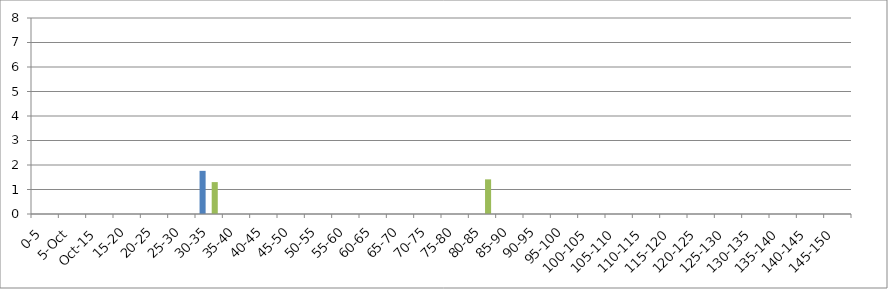
| Category | 12 UNION_ALL | 12 INTERSECTION_ALL | 12 UNION(INTERSECTION_119875_146067,INTERSECTION_119875_241240,INTERSECTION_146067_241240) |
|---|---|---|---|
| 0-5 | 0 | 0 | 0 |
| 5-Oct | 0 | 0 | 0 |
| Oct-15 | 0 | 0 | 0 |
| 15-20 | 0 | 0 | 0 |
| 20-25 | 0 | 0 | 0 |
| 25-30 | 0 | 0 | 0 |
| 30-35 | 1.761 | 0 | 1.302 |
| 35-40 | 0 | 0 | 0 |
| 40-45 | 0 | 0 | 0 |
| 45-50 | 0 | 0 | 0 |
| 50-55 | 0 | 0 | 0 |
| 55-60 | 0 | 0 | 0 |
| 60-65 | 0 | 0 | 0 |
| 65-70 | 0 | 0 | 0 |
| 70-75 | 0 | 0 | 0 |
| 75-80 | 0 | 0 | 0 |
| 80-85 | 0 | 0 | 1.414 |
| 85-90 | 0 | 0 | 0 |
| 90-95 | 0 | 0 | 0 |
| 95-100 | 0 | 0 | 0 |
| 100-105 | 0 | 0 | 0 |
| 105-110 | 0 | 0 | 0 |
| 110-115 | 0 | 0 | 0 |
| 115-120 | 0 | 0 | 0 |
| 120-125 | 0 | 0 | 0 |
| 125-130 | 0 | 0 | 0 |
| 130-135 | 0 | 0 | 0 |
| 135-140 | 0 | 0 | 0 |
| 140-145 | 0 | 0 | 0 |
| 145-150 | 0 | 0 | 0 |